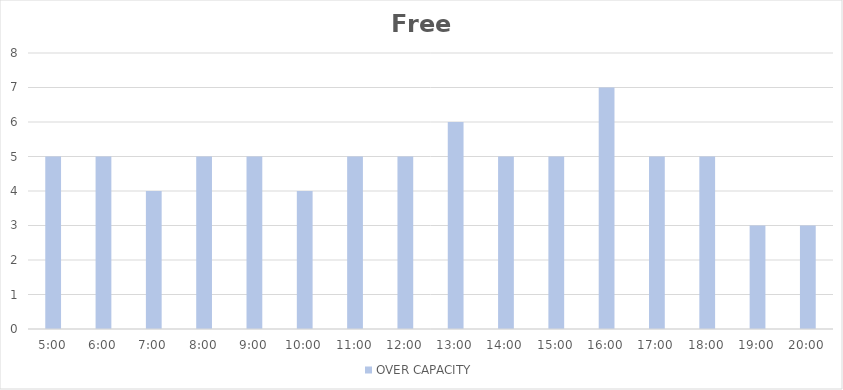
| Category | OVER CAPACITY |
|---|---|
| 0.20833333333333334 | 5 |
| 0.25 | 5 |
| 0.2916666666666667 | 4 |
| 0.3333333333333333 | 5 |
| 0.375 | 5 |
| 0.4166666666666667 | 4 |
| 0.4583333333333333 | 5 |
| 0.5 | 5 |
| 0.5416666666666666 | 6 |
| 0.5833333333333334 | 5 |
| 0.625 | 5 |
| 0.6666666666666666 | 7 |
| 0.7083333333333334 | 5 |
| 0.75 | 5 |
| 0.7916666666666666 | 3 |
| 0.8333333333333334 | 3 |